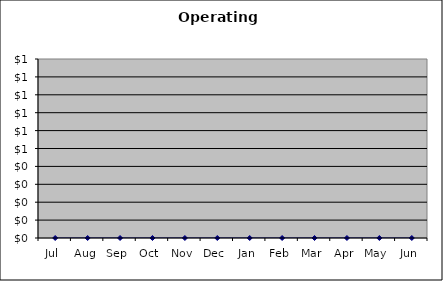
| Category | Total Operating Expenses |
|---|---|
| Jul | 0 |
| Aug | 0 |
| Sep | 0 |
| Oct | 0 |
| Nov | 0 |
| Dec | 0 |
| Jan | 0 |
| Feb | 0 |
| Mar | 0 |
| Apr | 0 |
| May | 0 |
| Jun | 0 |